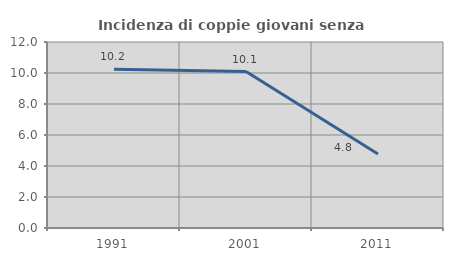
| Category | Incidenza di coppie giovani senza figli |
|---|---|
| 1991.0 | 10.234 |
| 2001.0 | 10.096 |
| 2011.0 | 4.773 |